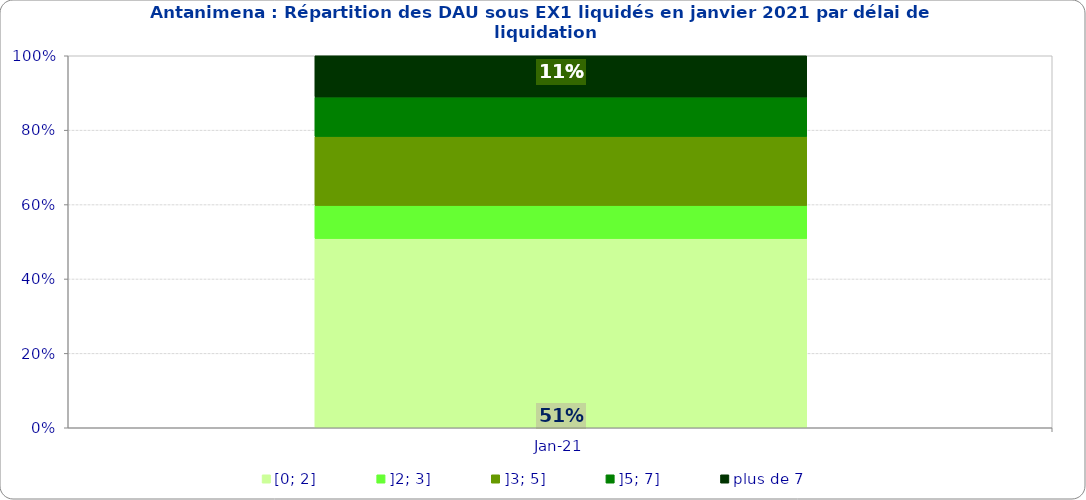
| Category | [0; 2] | ]2; 3] | ]3; 5] | ]5; 7] | plus de 7 |
|---|---|---|---|---|---|
| 2021-01-01 | 0.509 | 0.089 | 0.185 | 0.106 | 0.111 |